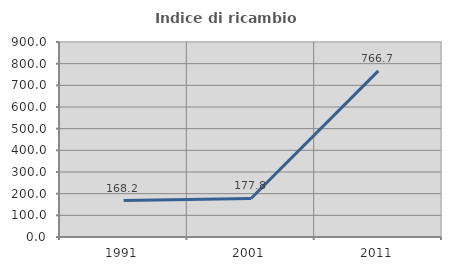
| Category | Indice di ricambio occupazionale  |
|---|---|
| 1991.0 | 168.182 |
| 2001.0 | 177.778 |
| 2011.0 | 766.667 |